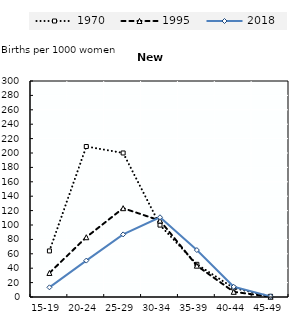
| Category | 1970 | 1995 | 2018 |
|---|---|---|---|
| 15-19 | 63.98 | 33.39 | 13.43 |
| 20-24 | 209.02 | 83.01 | 50.56 |
| 25-29 | 200.04 | 123.36 | 86.95 |
| 30-34 | 99.86 | 106.15 | 110.73 |
| 35-39 | 45.37 | 43.5 | 65.21 |
| 40-44 | 12.43 | 7.19 | 14.18 |
| 45-49 | 0.95 | 0.37 | 0.9 |